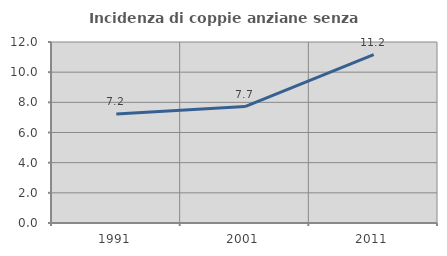
| Category | Incidenza di coppie anziane senza figli  |
|---|---|
| 1991.0 | 7.232 |
| 2001.0 | 7.722 |
| 2011.0 | 11.165 |